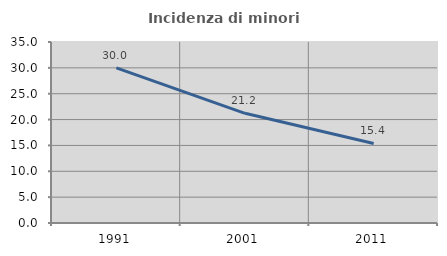
| Category | Incidenza di minori stranieri |
|---|---|
| 1991.0 | 30 |
| 2001.0 | 21.212 |
| 2011.0 | 15.385 |